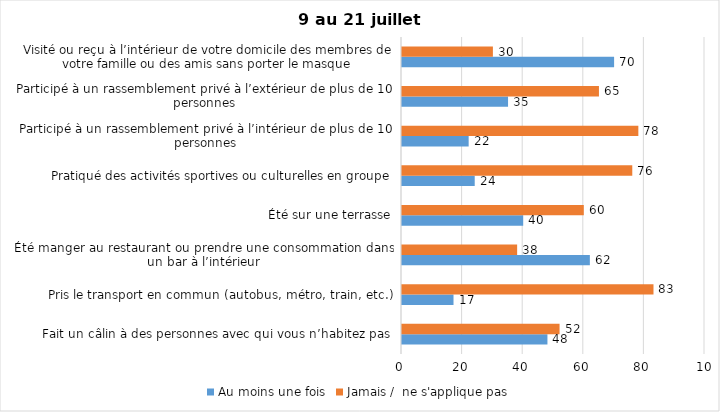
| Category | Au moins une fois | Jamais /  ne s'applique pas |
|---|---|---|
| Fait un câlin à des personnes avec qui vous n’habitez pas | 48 | 52 |
| Pris le transport en commun (autobus, métro, train, etc.) | 17 | 83 |
| Été manger au restaurant ou prendre une consommation dans un bar à l’intérieur | 62 | 38 |
| Été sur une terrasse | 40 | 60 |
| Pratiqué des activités sportives ou culturelles en groupe | 24 | 76 |
| Participé à un rassemblement privé à l’intérieur de plus de 10 personnes | 22 | 78 |
| Participé à un rassemblement privé à l’extérieur de plus de 10 personnes | 35 | 65 |
| Visité ou reçu à l’intérieur de votre domicile des membres de votre famille ou des amis sans porter le masque | 70 | 30 |